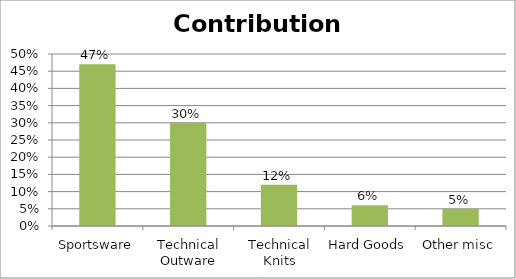
| Category | Contribution Margin |
|---|---|
| Sportsware | 0.47 |
| Technical Outware | 0.3 |
| Technical Knits | 0.12 |
| Hard Goods | 0.06 |
| Other misc | 0.05 |